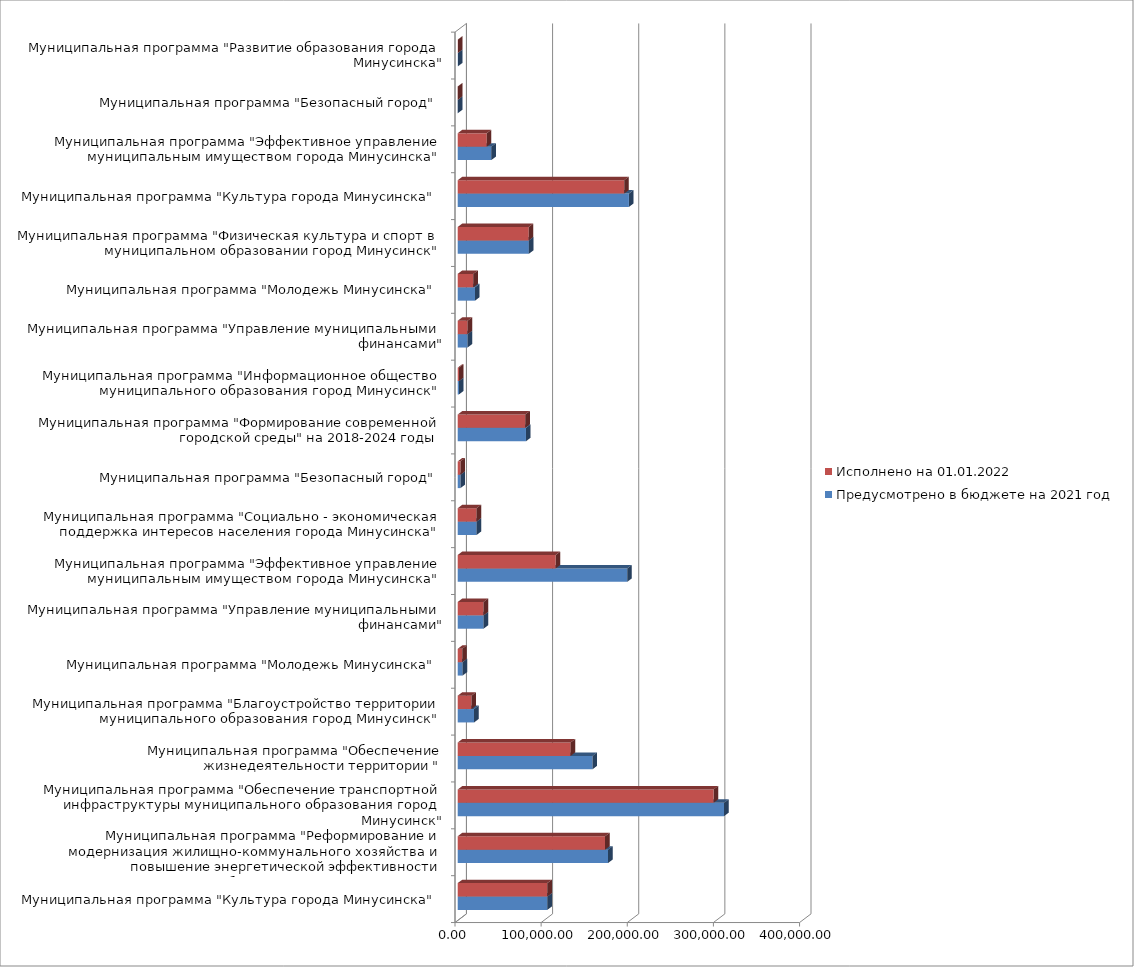
| Category | Предусмотрено в бюджете на 2021 год | Исполнено на 01.01.2022 |
|---|---|---|
| Муниципальная программа "Культура города Минусинска" | 104044.36 | 104044.36 |
| Муниципальная программа "Реформирование и модернизация жилищно-коммунального хозяйства и повышение энергетической эффективности муниципального образования город Минусинск" | 174556.4 | 171124.04 |
| Муниципальная программа "Обеспечение транспортной инфраструктуры муниципального образования город Минусинск" | 309212.42 | 297134.73 |
| Муниципальная программа "Обеспечение жизнедеятельности территории " | 156473.02 | 131056.8 |
| Муниципальная программа "Благоустройство территории муниципального образования город Минусинск" | 18997.22 | 16012.98 |
| Муниципальная программа "Молодежь Минусинска" | 5653.2 | 5202.05 |
| Муниципальная программа "Управление муниципальными финансами" | 30027.99 | 30027.99 |
| Муниципальная программа "Эффективное управление муниципальным имуществом города Минусинска" | 196836.23 | 113736.36 |
| Муниципальная программа "Социально - экономическая поддержка интересов населения города Минусинска" | 21914.79 | 21914.79 |
| Муниципальная программа "Безопасный город" | 3189.95 | 3189.95 |
| Муниципальная программа "Формирование современной городской среды" на 2018-2024 годы | 79240.9 | 78473.24 |
| Муниципальная программа "Информационное общество муниципального образования город Минусинск" | 1484.67 | 1471.67 |
| Муниципальная программа "Управление муниципальными финансами" | 11446.4 | 11446.4 |
| Муниципальная программа "Молодежь Минусинска" | 20086.84 | 18179.07 |
| Муниципальная программа "Физическая культура и спорт в муниципальном образовании город Минусинск" | 82596.94 | 82456.09 |
| Муниципальная программа "Культура города Минусинска" | 198754.65 | 193295.75 |
| Муниципальная программа "Эффективное управление муниципальным имуществом города Минусинска" | 39068.78 | 33711.91 |
| Муниципальная программа "Безопасный город" | 119.36 | 119.36 |
| Муниципальная программа "Развитие образования города Минусинска" | 226.38 | 226.38 |